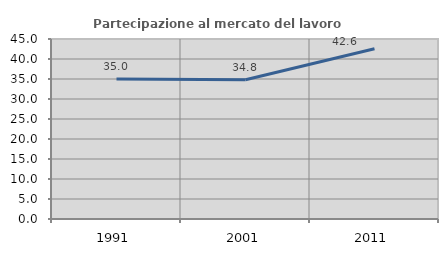
| Category | Partecipazione al mercato del lavoro  femminile |
|---|---|
| 1991.0 | 35.029 |
| 2001.0 | 34.821 |
| 2011.0 | 42.559 |